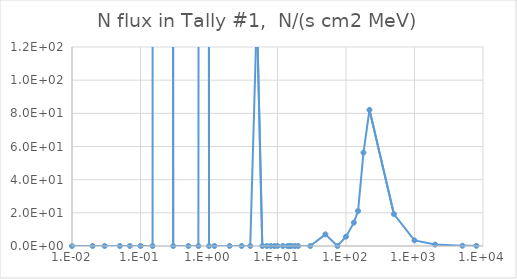
| Category | Series 0 |
|---|---|
| 1e-09 | 0 |
| 1e-08 | 0 |
| 2.5e-08 | 0 |
| 1e-07 | 0 |
| 2e-07 | 0 |
| 5e-07 | 0 |
| 1e-06 | 0 |
| 2e-06 | 0 |
| 5e-06 | 0 |
| 1e-05 | 0 |
| 2e-05 | 0 |
| 5e-05 | 0 |
| 0.0001 | 0 |
| 0.0002 | 0 |
| 0.0005 | 0 |
| 0.001 | 0 |
| 0.002 | 0 |
| 0.005 | 0 |
| 0.01 | 0 |
| 0.02 | 0 |
| 0.03 | 0 |
| 0.05 | 0 |
| 0.07 | 0 |
| 0.1 | 0 |
| 0.15 | 0 |
| 0.2 | 28014.6 |
| 0.3 | 0 |
| 0.5 | 0 |
| 0.7 | 0 |
| 0.9 | 7019.75 |
| 1.0 | 0 |
| 1.2 | 0 |
| 2.0 | 0 |
| 3.0 | 0 |
| 4.0 | 0 |
| 5.0 | 140.714 |
| 6.0 | 0 |
| 7.0 | 0 |
| 8.0 | 0 |
| 9.0 | 0 |
| 10.0 | 0 |
| 12.0 | 0 |
| 14.0 | 0 |
| 15.0 | 0 |
| 16.0 | 0 |
| 18.0 | 0 |
| 20.0 | 0 |
| 30.0 | 0 |
| 50.0 | 7.036 |
| 75.0 | 0 |
| 100.0 | 5.628 |
| 130.0 | 14.071 |
| 150.0 | 21.107 |
| 180.0 | 56.284 |
| 220.0 | 82.124 |
| 500.0 | 19.279 |
| 1000.0 | 3.378 |
| 2000.0 | 0.844 |
| 5000.0 | 0.141 |
| 8000.0 | 0.094 |